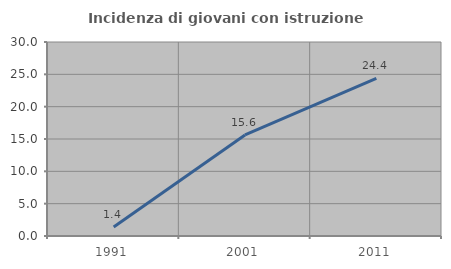
| Category | Incidenza di giovani con istruzione universitaria |
|---|---|
| 1991.0 | 1.389 |
| 2001.0 | 15.625 |
| 2011.0 | 24.39 |